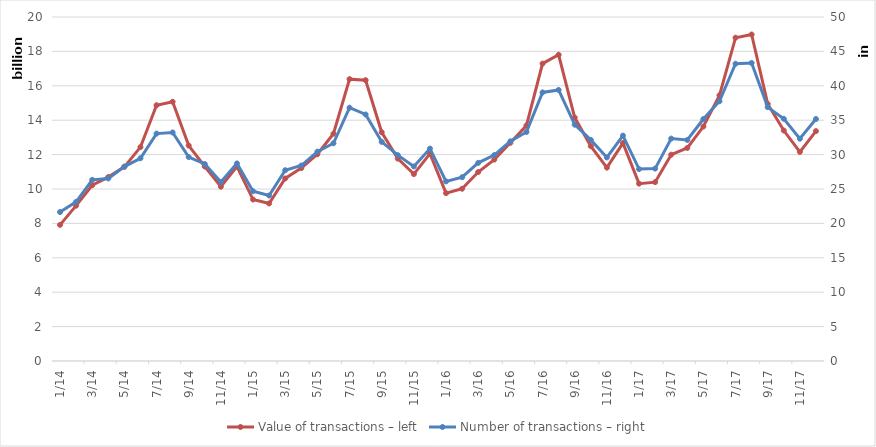
| Category | Value of transactions – left |
|---|---|
| 2014-01-01 | 7914042185 |
| 2014-02-01 | 9031922572 |
| 2014-03-01 | 10220232881 |
| 2014-04-01 | 10693230609 |
| 2014-05-01 | 11289320296 |
| 2014-06-01 | 12437142542 |
| 2014-07-01 | 14870474891 |
| 2014-08-01 | 15072059150 |
| 2014-09-01 | 12525454185 |
| 2014-10-01 | 11307047722 |
| 2014-11-01 | 10133723149 |
| 2014-12-01 | 11307174663 |
| 2015-01-01 | 9386912314 |
| 2015-02-01 | 9160614175 |
| 2015-03-01 | 10612974667 |
| 2015-04-01 | 11214694440 |
| 2015-05-01 | 12018763667 |
| 2015-06-01 | 13214163248 |
| 2015-07-01 | 16387336064 |
| 2015-08-01 | 16326356127 |
| 2015-09-01 | 13297685009 |
| 2015-10-01 | 11765913930 |
| 2015-11-01 | 10866644751 |
| 2015-12-01 | 12056172703 |
| 2016-01-01 | 9759602843 |
| 2016-02-01 | 10015590417 |
| 2016-03-01 | 10986665753 |
| 2016-04-01 | 11710392473 |
| 2016-05-01 | 12684892572 |
| 2016-06-01 | 13695129318 |
| 2016-07-01 | 17289715055 |
| 2016-08-01 | 17804659243 |
| 2016-09-01 | 14152394312 |
| 2016-10-01 | 12495649089 |
| 2016-11-01 | 11242882731 |
| 2016-12-01 | 12669662952 |
| 2017-01-01 | 10310547061 |
| 2017-02-01 | 10398491846 |
| 2017-03-01 | 11994769173 |
| 2017-04-01 | 12388647476 |
| 2017-05-01 | 13632022458 |
| 2017-06-01 | 15446235173 |
| 2017-07-01 | 18797792554 |
| 2017-08-01 | 18982858496 |
| 2017-09-01 | 14944597785 |
| 2017-10-01 | 13399521673 |
| 2017-11-01 | 12155625084 |
| 2017-12-01 | 13365620959 |